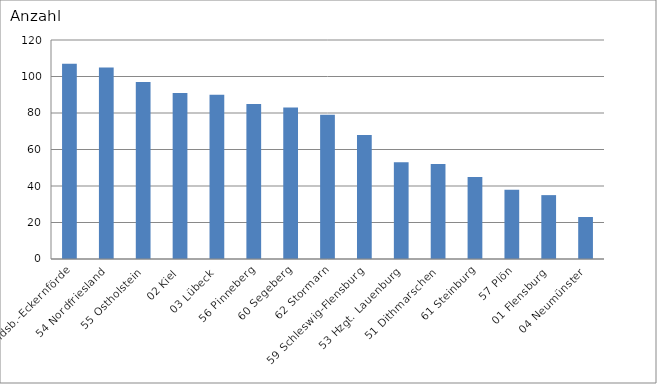
| Category | 58 Rendsb.-Eckernförde |
|---|---|
| 58 Rendsb.-Eckernförde | 107 |
| 54 Nordfriesland | 105 |
| 55 Ostholstein | 97 |
| 02 Kiel | 91 |
| 03 Lübeck | 90 |
| 56 Pinneberg | 85 |
| 60 Segeberg | 83 |
| 62 Stormarn | 79 |
| 59 Schleswig-Flensburg | 68 |
| 53 Hzgt. Lauenburg | 53 |
| 51 Dithmarschen | 52 |
| 61 Steinburg | 45 |
| 57 Plön | 38 |
| 01 Flensburg | 35 |
| 04 Neumünster | 23 |